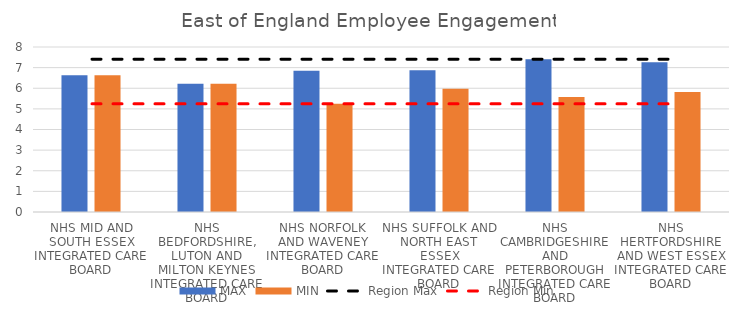
| Category | MAX | MIN |
|---|---|---|
| NHS MID AND SOUTH ESSEX INTEGRATED CARE BOARD | 6.628 | 6.628 |
| NHS BEDFORDSHIRE, LUTON AND MILTON KEYNES INTEGRATED CARE BOARD | 6.218 | 6.218 |
| NHS NORFOLK AND WAVENEY INTEGRATED CARE BOARD | 6.852 | 5.246 |
| NHS SUFFOLK AND NORTH EAST ESSEX INTEGRATED CARE BOARD | 6.867 | 5.982 |
| NHS CAMBRIDGESHIRE AND PETERBOROUGH INTEGRATED CARE BOARD | 7.41 | 5.577 |
| NHS HERTFORDSHIRE AND WEST ESSEX INTEGRATED CARE BOARD | 7.266 | 5.82 |